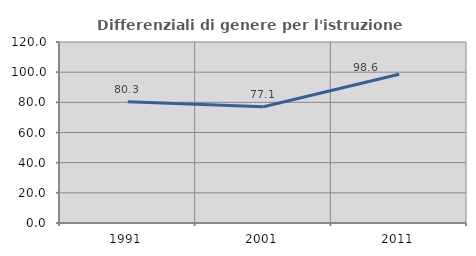
| Category | Differenziali di genere per l'istruzione superiore |
|---|---|
| 1991.0 | 80.328 |
| 2001.0 | 77.075 |
| 2011.0 | 98.609 |